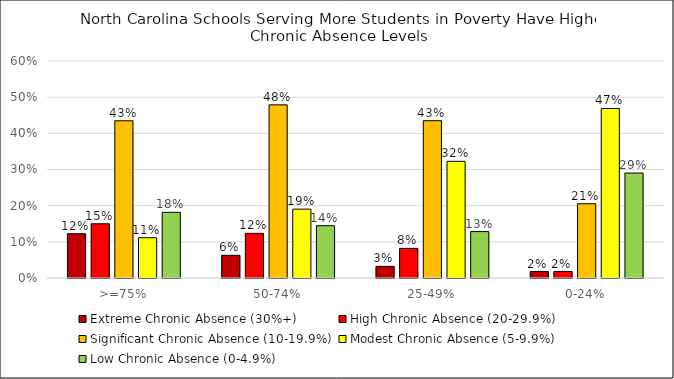
| Category | Extreme Chronic Absence (30%+) | High Chronic Absence (20-29.9%) | Significant Chronic Absence (10-19.9%) | Modest Chronic Absence (5-9.9%) | Low Chronic Absence (0-4.9%) |
|---|---|---|---|---|---|
| >=75% | 0.122 | 0.15 | 0.435 | 0.111 | 0.182 |
| 50-74% | 0.063 | 0.123 | 0.479 | 0.19 | 0.145 |
| 25-49% | 0.032 | 0.082 | 0.435 | 0.323 | 0.128 |
| 0-24% | 0.018 | 0.018 | 0.205 | 0.469 | 0.29 |